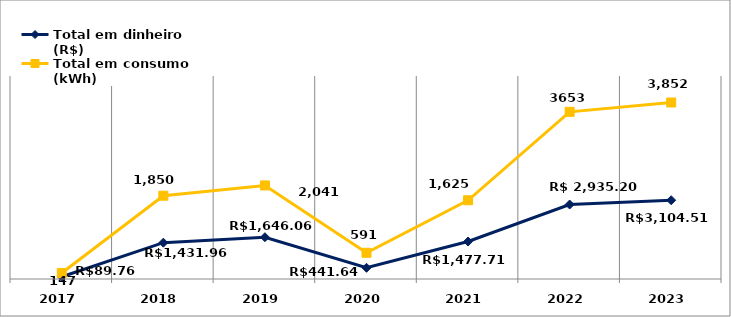
| Category | Total em dinheiro (R$) | Total em consumo (kWh) |
|---|---|---|
| 2017.0 | 89.76 | 147 |
| 2018.0 | 1431.96 | 1850 |
| 2019.0 | 1646.06 | 2041 |
| 2020.0 | 441.64 | 591 |
| 2021.0 | 1477.71 | 1625 |
| 2022.0 | 2935.2 | 3653 |
| 2023.0 | 3104.51 | 3852 |